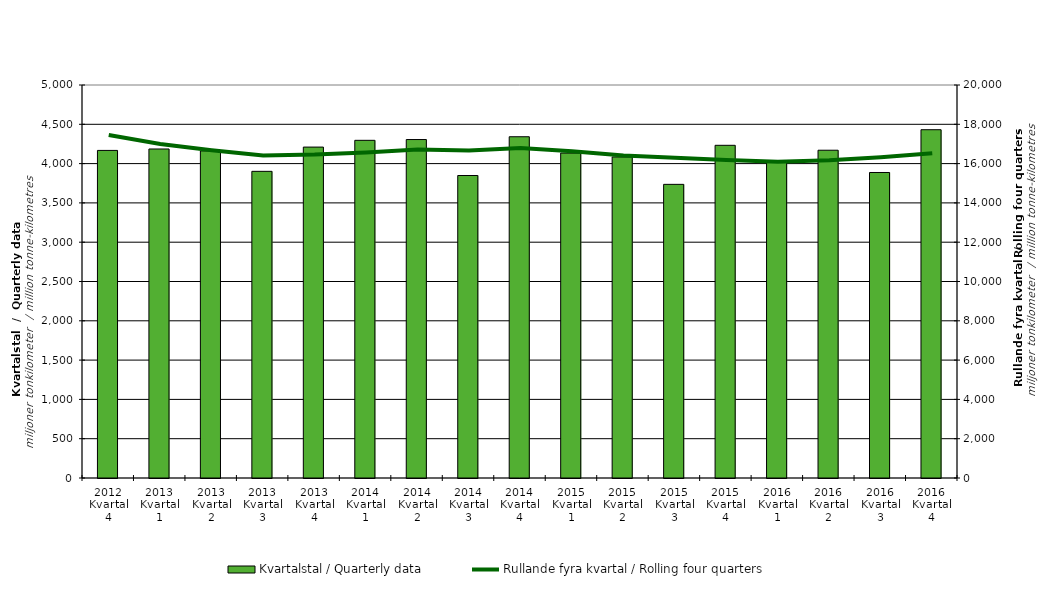
| Category | Kvartalstal / Quarterly data |
|---|---|
| 2012 Kvartal 4 | 4167.699 |
| 2013 Kvartal 1 | 4185.837 |
| 2013 Kvartal 2 | 4161.615 |
| 2013 Kvartal 3 | 3901.557 |
| 2013 Kvartal 4 | 4210.16 |
| 2014 Kvartal 1 | 4296.225 |
| 2014 Kvartal 2 | 4306.168 |
| 2014 Kvartal 3 | 3848.435 |
| 2014 Kvartal 4 | 4341.663 |
| 2015 Kvartal 1 | 4134.206 |
| 2015 Kvartal 2 | 4084.455 |
| 2015 Kvartal 3 | 3736.027 |
| 2015 Kvartal 4 | 4232.683 |
| 2016 Kvartal 1 | 4037.195 |
| 2016 Kvartal 2 | 4170.244 |
| 2016 Kvartal 3 | 3886.967 |
| 2016 Kvartal 4 | 4431.072 |